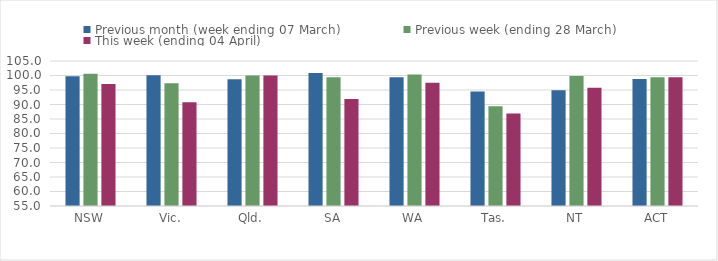
| Category | Previous month (week ending 07 March) | Previous week (ending 28 March) | This week (ending 04 April) |
|---|---|---|---|
| NSW | 99.779 | 100.585 | 97.048 |
| Vic. | 100.096 | 97.355 | 90.748 |
| Qld. | 98.682 | 100 | 100 |
| SA | 100.827 | 99.424 | 91.885 |
| WA | 99.414 | 100.367 | 97.535 |
| Tas. | 94.469 | 89.436 | 86.888 |
| NT | 94.934 | 99.814 | 95.742 |
| ACT | 98.774 | 99.389 | 99.389 |